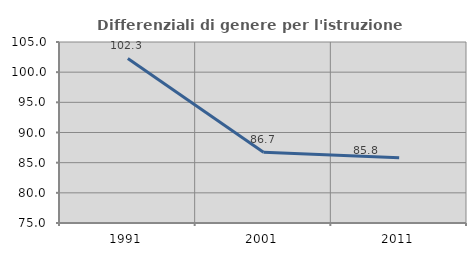
| Category | Differenziali di genere per l'istruzione superiore |
|---|---|
| 1991.0 | 102.271 |
| 2001.0 | 86.726 |
| 2011.0 | 85.828 |